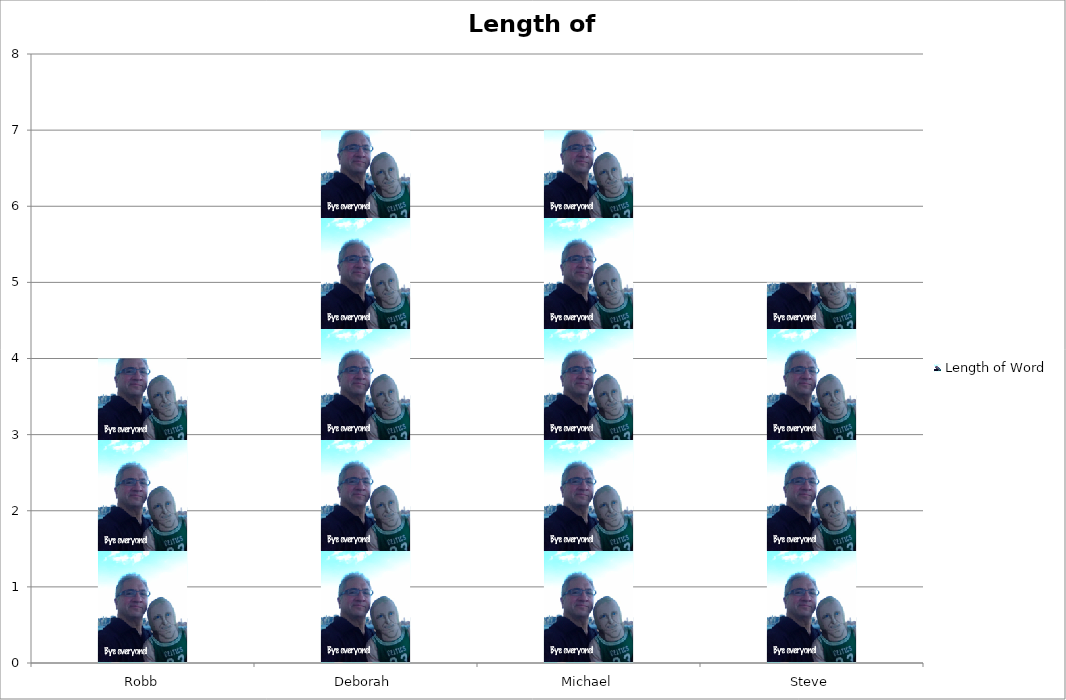
| Category | Length of Word |
|---|---|
| Robb | 4 |
| Deborah | 7 |
| Michael | 7 |
| Steve | 5 |